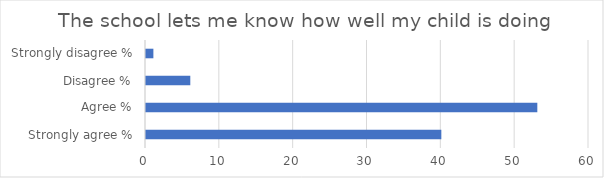
| Category | Series 1 |
|---|---|
| Strongly agree % | 40 |
| Agree % | 53 |
| Disagree % | 6 |
| Strongly disagree % | 1 |